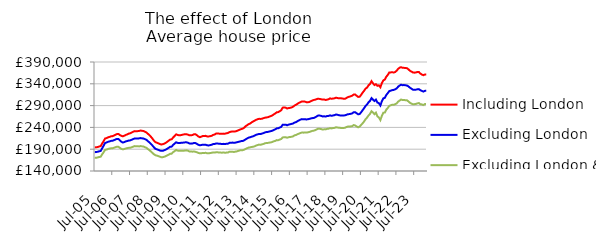
| Category | Including London | Excluding London | Excluding London & SE |
|---|---|---|---|
| 2005-07-01 | 194071.909 | 183198.473 | 170054.667 |
| 2005-08-01 | 194408.873 | 183566.7 | 170290.975 |
| 2005-09-01 | 195011.417 | 184145.57 | 171058.141 |
| 2005-10-01 | 196181.058 | 185175.647 | 172104.441 |
| 2005-11-01 | 197023.625 | 185905.097 | 172727.526 |
| 2005-12-01 | 202962.896 | 192027.666 | 178095.343 |
| 2006-01-01 | 208412.312 | 197924.655 | 183004.726 |
| 2006-02-01 | 214499.109 | 204340.929 | 188459.219 |
| 2006-03-01 | 215515.616 | 205448.075 | 189238.319 |
| 2006-04-01 | 217191.313 | 206953.722 | 190464.514 |
| 2006-05-01 | 218233.419 | 207889.397 | 191430.541 |
| 2006-06-01 | 219510.815 | 209056.395 | 192088.052 |
| 2006-07-01 | 219914.259 | 209299.816 | 192220.306 |
| 2006-08-01 | 221414.125 | 210732.675 | 193205.41 |
| 2006-09-01 | 223135.031 | 212260.562 | 194590.262 |
| 2006-10-01 | 224622.122 | 213617.247 | 195807.769 |
| 2006-11-01 | 225033.928 | 213504.465 | 195463.549 |
| 2006-12-01 | 222513.459 | 209998.883 | 193008.61 |
| 2007-01-01 | 220589.243 | 207143.587 | 190742.314 |
| 2007-02-01 | 219585.779 | 205318.226 | 189667.53 |
| 2007-03-01 | 220992.009 | 206425.132 | 190446.333 |
| 2007-04-01 | 222808.972 | 207952.089 | 191698.875 |
| 2007-05-01 | 223946.863 | 208722.715 | 192460.838 |
| 2007-06-01 | 225752.01 | 209929.049 | 193166.985 |
| 2007-07-01 | 226550.853 | 210220.443 | 193358.551 |
| 2007-08-01 | 228414.553 | 211729.542 | 194437.917 |
| 2007-09-01 | 230104.064 | 213338.913 | 195923.514 |
| 2007-10-01 | 231450.555 | 214650.822 | 197085.66 |
| 2007-11-01 | 231179.876 | 214500.722 | 196695.3 |
| 2007-12-01 | 231433.737 | 214698.766 | 196726.404 |
| 2008-01-01 | 231862.829 | 214849.19 | 196399.051 |
| 2008-02-01 | 232777.92 | 215493.734 | 197118.829 |
| 2008-03-01 | 232177.934 | 214912.252 | 196522.633 |
| 2008-04-01 | 231593.431 | 214425.668 | 196207.865 |
| 2008-05-01 | 230034.299 | 212962.03 | 194502.235 |
| 2008-06-01 | 228228.769 | 211227.808 | 192961.246 |
| 2008-07-01 | 225035.701 | 208190.44 | 190121.885 |
| 2008-08-01 | 222117.145 | 205454.248 | 187709.451 |
| 2008-09-01 | 218352.898 | 202172.132 | 184588.973 |
| 2008-10-01 | 214227.176 | 198409.299 | 181517.399 |
| 2008-11-01 | 209529.519 | 194260.851 | 178336.24 |
| 2008-12-01 | 206241.589 | 190978.017 | 176106.662 |
| 2009-01-01 | 204766.945 | 189683.657 | 175322.257 |
| 2009-02-01 | 203425.693 | 188421.609 | 174061.388 |
| 2009-03-01 | 201733.2 | 187006.194 | 172781.259 |
| 2009-04-01 | 200864.309 | 186232.901 | 171562.078 |
| 2009-05-01 | 201377.137 | 186332.796 | 171727.792 |
| 2009-06-01 | 202903.735 | 187658.201 | 172669.661 |
| 2009-07-01 | 204635.206 | 189001.849 | 174079.384 |
| 2009-08-01 | 206997.509 | 191194.202 | 175880.831 |
| 2009-09-01 | 209709.561 | 193271.161 | 177525.74 |
| 2009-10-01 | 212208.729 | 195678.887 | 179517.45 |
| 2009-11-01 | 212654.967 | 195913.817 | 179783.279 |
| 2009-12-01 | 217045.418 | 200060.689 | 183400.736 |
| 2010-01-01 | 220328.658 | 202757.425 | 185659.033 |
| 2010-02-01 | 224087.725 | 205898.507 | 188250.621 |
| 2010-03-01 | 222679.125 | 204469.399 | 186759.2 |
| 2010-04-01 | 221932.015 | 204033.571 | 186285.179 |
| 2010-05-01 | 222126.787 | 204490.986 | 186342.253 |
| 2010-06-01 | 222964.404 | 204790.723 | 186429.21 |
| 2010-07-01 | 223710.277 | 205131.8 | 186451.734 |
| 2010-08-01 | 224451.864 | 205646.729 | 186987.423 |
| 2010-09-01 | 224267.605 | 205754.102 | 187323.927 |
| 2010-10-01 | 223377.258 | 204810.189 | 186536.499 |
| 2010-11-01 | 221777.534 | 202956.827 | 184876.656 |
| 2010-12-01 | 221917.443 | 202743.972 | 184646.859 |
| 2011-01-01 | 222405.556 | 203039.473 | 184359.133 |
| 2011-02-01 | 224135.395 | 204239.334 | 184801.4 |
| 2011-03-01 | 224406.84 | 204144.205 | 184028.341 |
| 2011-04-01 | 222135.13 | 202232.424 | 183006.569 |
| 2011-05-01 | 219190.106 | 200184.05 | 181492.094 |
| 2011-06-01 | 217499.799 | 198962.045 | 180558.333 |
| 2011-07-01 | 218744.114 | 199548.153 | 180767.981 |
| 2011-08-01 | 220368.131 | 200480.146 | 181422.988 |
| 2011-09-01 | 220347.569 | 200202.855 | 181435.266 |
| 2011-10-01 | 220616.325 | 200198.193 | 181690.128 |
| 2011-11-01 | 219194.902 | 198823.496 | 180615.401 |
| 2011-12-01 | 219267.503 | 198694.385 | 180775.819 |
| 2012-01-01 | 219928.388 | 199305.463 | 181128.302 |
| 2012-02-01 | 220752.034 | 200151.902 | 181847.417 |
| 2012-03-01 | 222758.722 | 201696.282 | 182410.504 |
| 2012-04-01 | 223673.701 | 201860.751 | 182156.013 |
| 2012-05-01 | 225950.013 | 203140.429 | 182990.087 |
| 2012-06-01 | 225872.597 | 202887.844 | 182906.004 |
| 2012-07-01 | 225713.292 | 202636.986 | 182398.177 |
| 2012-08-01 | 225190.084 | 202282.38 | 182253.228 |
| 2012-09-01 | 225387.307 | 201900.121 | 182004.725 |
| 2012-10-01 | 225721.554 | 202224.836 | 182619.911 |
| 2012-11-01 | 225691.958 | 201673.566 | 181788.36 |
| 2012-12-01 | 226421.94 | 202543.339 | 182251.583 |
| 2013-01-01 | 227195.554 | 202674.63 | 182335.002 |
| 2013-02-01 | 229210.693 | 204561.546 | 184272.62 |
| 2013-03-01 | 230129.429 | 204748.767 | 184017.1 |
| 2013-04-01 | 230712.482 | 205151.497 | 184362.85 |
| 2013-05-01 | 230551.196 | 204768.722 | 183613.68 |
| 2013-06-01 | 230839.454 | 205055.323 | 184379.351 |
| 2013-07-01 | 231821.538 | 205847.849 | 185003.345 |
| 2013-08-01 | 233326.744 | 206802.74 | 186231.544 |
| 2013-09-01 | 234754.498 | 207635.764 | 187214.478 |
| 2013-10-01 | 236190.006 | 208532.653 | 187806.984 |
| 2013-11-01 | 237160.886 | 208847.208 | 187853.812 |
| 2013-12-01 | 239469.325 | 210586.499 | 188853.504 |
| 2014-01-01 | 242790.006 | 212676.878 | 190653.171 |
| 2014-02-01 | 245119.876 | 214740.834 | 192243.39 |
| 2014-03-01 | 247593.436 | 216603.782 | 193752.541 |
| 2014-04-01 | 248854.276 | 217393.711 | 194252.626 |
| 2014-05-01 | 251463.816 | 218711.434 | 195145.586 |
| 2014-06-01 | 253556.466 | 219594.826 | 195508.112 |
| 2014-07-01 | 255388.278 | 221198.267 | 196601.442 |
| 2014-08-01 | 257365.594 | 222966.779 | 198316.32 |
| 2014-09-01 | 258696.486 | 224015.093 | 199432.105 |
| 2014-10-01 | 259600.018 | 224922.146 | 200554.065 |
| 2014-11-01 | 259488.657 | 224829.853 | 200167.665 |
| 2014-12-01 | 259918.568 | 225759.631 | 201113.605 |
| 2015-01-01 | 261151.596 | 226971.883 | 202031.561 |
| 2015-02-01 | 262220.948 | 228450.677 | 203601.016 |
| 2015-03-01 | 262799.109 | 229351.638 | 204225.024 |
| 2015-04-01 | 263395.723 | 229695.477 | 204462.982 |
| 2015-05-01 | 264658.741 | 230614.588 | 205037.355 |
| 2015-06-01 | 266105.081 | 231397.807 | 205694.105 |
| 2015-07-01 | 267443.177 | 232466.895 | 206556.36 |
| 2015-08-01 | 270016.474 | 234143.511 | 208156.41 |
| 2015-09-01 | 271965.795 | 235633.248 | 209125.402 |
| 2015-10-01 | 274709.304 | 237824.858 | 210845.205 |
| 2015-11-01 | 275043.634 | 237958.72 | 210660.86 |
| 2015-12-01 | 277179.644 | 239675.916 | 212130.135 |
| 2016-01-01 | 279397.321 | 241224.493 | 213361.207 |
| 2016-02-01 | 285318.802 | 246144.183 | 217082.357 |
| 2016-03-01 | 285545.05 | 246265.941 | 217187.599 |
| 2016-04-01 | 285335.827 | 246305.88 | 217334.667 |
| 2016-05-01 | 283266.747 | 244868.796 | 216379.973 |
| 2016-06-01 | 284335.022 | 246362.347 | 217545.05 |
| 2016-07-01 | 284847.537 | 247139.718 | 217931.483 |
| 2016-08-01 | 285777.451 | 247996.431 | 218543.182 |
| 2016-09-01 | 287399.926 | 248926.197 | 219413.806 |
| 2016-10-01 | 290135.43 | 251111.243 | 221738.148 |
| 2016-11-01 | 291897.326 | 252097.843 | 222661.813 |
| 2016-12-01 | 294178.57 | 254260.085 | 224419.531 |
| 2017-01-01 | 296358.26 | 256139.046 | 225705.864 |
| 2017-02-01 | 297973.477 | 257945.257 | 227205.814 |
| 2017-03-01 | 299497.204 | 258992.938 | 228256.455 |
| 2017-04-01 | 299277.407 | 258593.775 | 227956.608 |
| 2017-05-01 | 299125.157 | 258697.033 | 228269.92 |
| 2017-06-01 | 297854.706 | 258250.415 | 228061.476 |
| 2017-07-01 | 297778.805 | 258747.868 | 228669.759 |
| 2017-08-01 | 298202.844 | 259531.759 | 229523.806 |
| 2017-09-01 | 300117.918 | 260486.015 | 230764.34 |
| 2017-10-01 | 301592.834 | 261244.531 | 231944.632 |
| 2017-11-01 | 302886.164 | 261549.149 | 232532.649 |
| 2017-12-01 | 303638.316 | 263160.394 | 233776.003 |
| 2018-01-01 | 304960.335 | 265294.638 | 235366.304 |
| 2018-02-01 | 305858.143 | 267361.094 | 237080.585 |
| 2018-03-01 | 305226.8 | 267129.109 | 236819.593 |
| 2018-04-01 | 304546.433 | 266455.785 | 236087.756 |
| 2018-05-01 | 303728.051 | 265087.576 | 235037.534 |
| 2018-06-01 | 304057.852 | 265483.341 | 235593.812 |
| 2018-07-01 | 302880.725 | 264924.208 | 235451.363 |
| 2018-08-01 | 303633.96 | 266102.783 | 236650.013 |
| 2018-09-01 | 304466.67 | 266370.921 | 237026.286 |
| 2018-10-01 | 306560.144 | 267620.205 | 238406.163 |
| 2018-11-01 | 305650.282 | 266615.366 | 237630.11 |
| 2018-12-01 | 306235.918 | 267389.958 | 238573.028 |
| 2019-01-01 | 306703.423 | 268057.382 | 238894.231 |
| 2019-02-01 | 308132.652 | 269590.522 | 240267.36 |
| 2019-03-01 | 307368.863 | 268932.119 | 239720.993 |
| 2019-04-01 | 306672.68 | 267976.762 | 239286.874 |
| 2019-05-01 | 306763.661 | 267378.881 | 238890.212 |
| 2019-06-01 | 306525.503 | 267238.183 | 238459.033 |
| 2019-07-01 | 305855.905 | 267325.887 | 238606.025 |
| 2019-08-01 | 305593.763 | 267652.37 | 239105.678 |
| 2019-09-01 | 307260.383 | 268783.633 | 240654.275 |
| 2019-10-01 | 309356.179 | 270137.945 | 241922.192 |
| 2019-11-01 | 310430.712 | 270515.521 | 241963.832 |
| 2019-12-01 | 311424.864 | 271256.354 | 242393.331 |
| 2020-01-01 | 312901.397 | 272179.372 | 242972.128 |
| 2020-02-01 | 315359.406 | 274823.485 | 245348.955 |
| 2020-03-01 | 315400.509 | 274807.789 | 244390.086 |
| 2020-04-01 | 312475.729 | 272437.486 | 242007.66 |
| 2020-05-01 | 309882.901 | 269953.855 | 240175.471 |
| 2020-06-01 | 310422.672 | 270719.821 | 242001.045 |
| 2020-07-01 | 314572.689 | 274709.014 | 245645.218 |
| 2020-08-01 | 319732.395 | 279494.693 | 249413.777 |
| 2020-09-01 | 323978.874 | 284105.239 | 253624.963 |
| 2020-10-01 | 328971.815 | 289242.136 | 258847.035 |
| 2020-11-01 | 331317.265 | 292631.823 | 262537.293 |
| 2020-12-01 | 336573.779 | 297586.32 | 267349.411 |
| 2021-01-01 | 339650.241 | 300784.974 | 271003.781 |
| 2021-02-01 | 346045.619 | 307084.788 | 277137.528 |
| 2021-03-01 | 341176.977 | 303696.21 | 274076.283 |
| 2021-04-01 | 337137.081 | 300481.059 | 270297.777 |
| 2021-05-01 | 339140.715 | 303658.279 | 273721.987 |
| 2021-06-01 | 335397.467 | 296993.376 | 265220.862 |
| 2021-07-01 | 336497.987 | 295661.695 | 262727.57 |
| 2021-08-01 | 332028.213 | 290321.742 | 256786.717 |
| 2021-09-01 | 341612.759 | 300109.831 | 266503.941 |
| 2021-10-01 | 347757.482 | 306673.293 | 273775.1 |
| 2021-11-01 | 349811.115 | 307715.659 | 274009.632 |
| 2021-12-01 | 356319.545 | 314323.258 | 280837.476 |
| 2022-01-01 | 360289.17 | 318616.224 | 284398.382 |
| 2022-02-01 | 365931.605 | 323270.355 | 289375.158 |
| 2022-03-01 | 366156.516 | 324262.025 | 290701.718 |
| 2022-04-01 | 366513.212 | 325493.373 | 291930.653 |
| 2022-05-01 | 365893.351 | 325969.616 | 291852.524 |
| 2022-06-01 | 367071.773 | 327467.604 | 293204.096 |
| 2022-07-01 | 369983.42 | 329364.877 | 294959.713 |
| 2022-08-01 | 374211.412 | 333370.43 | 299060.488 |
| 2022-09-01 | 377015.776 | 336031.352 | 301593.741 |
| 2022-10-01 | 378074.491 | 337869.992 | 303980.356 |
| 2022-11-01 | 376626.016 | 336825.132 | 302800.513 |
| 2022-12-01 | 376563.088 | 337084.707 | 302914.745 |
| 2023-01-01 | 376290.805 | 336649.027 | 302248.16 |
| 2023-02-01 | 375740.812 | 335980.387 | 302083.48 |
| 2023-03-01 | 373080.285 | 333902.126 | 299445.886 |
| 2023-04-01 | 369834.635 | 330921.448 | 296430.233 |
| 2023-05-01 | 367922.171 | 328788.786 | 294491.521 |
| 2023-06-01 | 366065.173 | 326427.67 | 293071.295 |
| 2023-07-01 | 365537.425 | 326191.374 | 293264.695 |
| 2023-08-01 | 366021.83 | 326584.469 | 293895.804 |
| 2023-09-01 | 367039.49 | 327354.652 | 295026.329 |
| 2023-10-01 | 367041.51 | 327794.295 | 295867.543 |
| 2023-11-01 | 363576.015 | 325268.562 | 293289.299 |
| 2023-12-01 | 361346.415 | 323841.136 | 292743.348 |
| 2024-01-01 | 359701.947 | 322128.785 | 291257.398 |
| 2024-02-01 | 361151.885 | 323781.508 | 293513.952 |
| 2024-03-01 | 361367.553 | 324038.924 | 293716.411 |